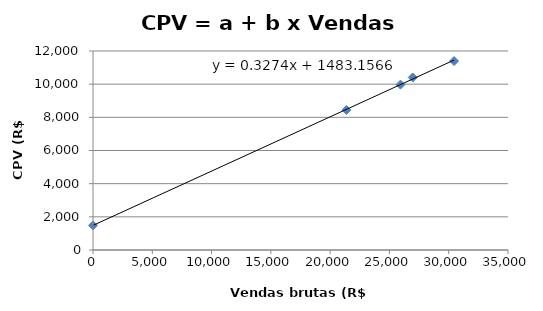
| Category | CPV (R$ mil) |
|---|---|
| 0.0 | 1483.157 |
| 21370.2 | 8443.636 |
| 25929.176 | 9973.932 |
| 26966.343 | 10402.841 |
| 30448.854 | 11394.652 |